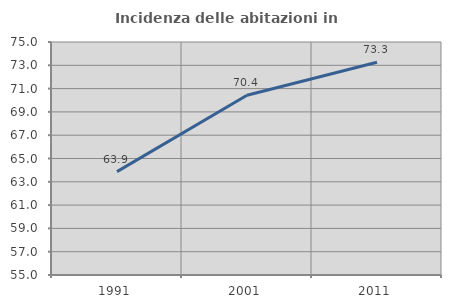
| Category | Incidenza delle abitazioni in proprietà  |
|---|---|
| 1991.0 | 63.872 |
| 2001.0 | 70.432 |
| 2011.0 | 73.256 |